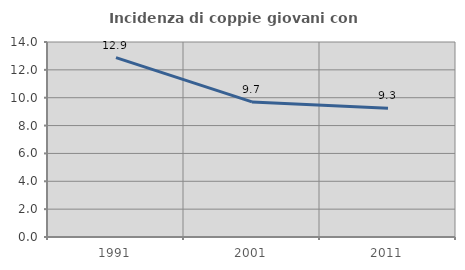
| Category | Incidenza di coppie giovani con figli |
|---|---|
| 1991.0 | 12.878 |
| 2001.0 | 9.697 |
| 2011.0 | 9.252 |